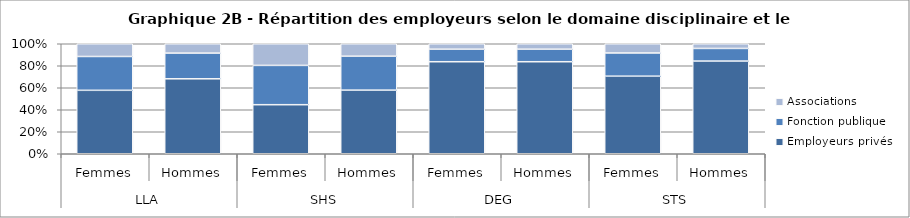
| Category | Employeurs privés | Fonction publique | Associations |
|---|---|---|---|
| 0 | 57.66 | 30.75 | 11.57 |
| 1 | 68.15 | 23.36 | 8.49 |
| 2 | 44.59 | 35.74 | 19.66 |
| 3 | 57.86 | 30.83 | 11.32 |
| 4 | 83.66 | 11.39 | 4.95 |
| 5 | 83.66 | 11.39 | 4.95 |
| 6 | 70.53 | 21.11 | 8.37 |
| 7 | 84.27 | 11.48 | 4.25 |